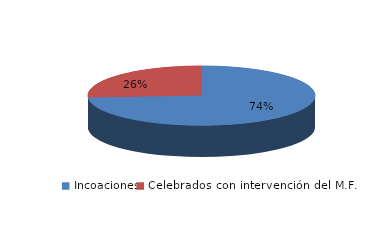
| Category | Series 0 |
|---|---|
| Incoaciones | 3011 |
| Celebrados con intervención del M.F. | 1062 |